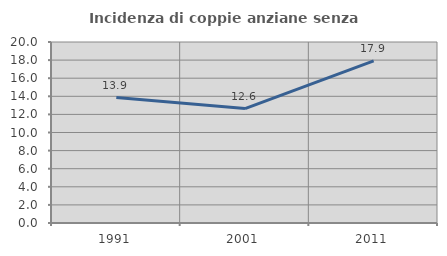
| Category | Incidenza di coppie anziane senza figli  |
|---|---|
| 1991.0 | 13.855 |
| 2001.0 | 12.644 |
| 2011.0 | 17.919 |